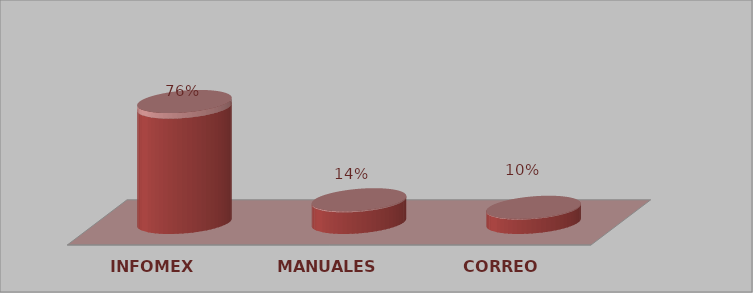
| Category | Series 0 | Series 1 |
|---|---|---|
| INFOMEX | 16 | 0.762 |
| MANUALES | 3 | 0.143 |
| CORREO | 2 | 0.095 |